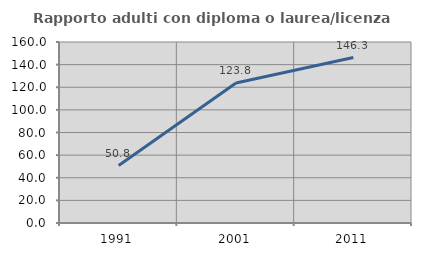
| Category | Rapporto adulti con diploma o laurea/licenza media  |
|---|---|
| 1991.0 | 50.82 |
| 2001.0 | 123.81 |
| 2011.0 | 146.281 |